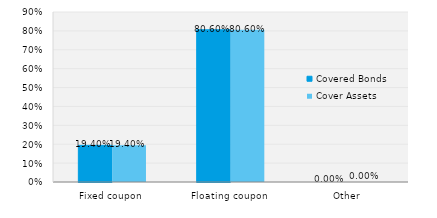
| Category | Covered Bonds | Cover Assets |
|---|---|---|
| Fixed coupon | 0.194 | 0.194 |
| Floating coupon | 0.806 | 0.806 |
| Other | 0 | 0 |